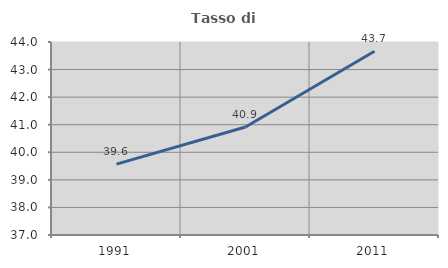
| Category | Tasso di occupazione   |
|---|---|
| 1991.0 | 39.572 |
| 2001.0 | 40.916 |
| 2011.0 | 43.666 |